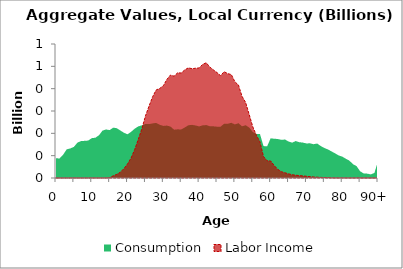
| Category | Consumption | Labor Income |
|---|---|---|
| 0 | 88.271 | 0 |
|  | 87.549 | 0 |
| 2 | 104.568 | 0 |
| 3 | 128.303 | 0 |
| 4 | 132.369 | 0 |
| 5 | 139.233 | 0 |
| 6 | 158.699 | 0 |
| 7 | 165.2 | 0 |
| 8 | 166.483 | 0 |
| 9 | 167.659 | 0 |
| 10 | 178.451 | 0 |
| 11 | 180.313 | 0 |
| 12 | 191.081 | 0 |
| 13 | 212.354 | 0 |
| 14 | 217.371 | 0 |
| 15 | 214.676 | 1.239 |
| 16 | 225.563 | 9.772 |
| 17 | 222.923 | 16.371 |
| 18 | 212.529 | 26.093 |
| 19 | 202.547 | 42.24 |
| 20 | 195.777 | 62.746 |
| 21 | 206.851 | 90.052 |
| 22 | 220.983 | 127.717 |
| 23 | 231.092 | 172.924 |
| 24 | 235.935 | 220.232 |
| 25 | 241.862 | 277.8 |
| 26 | 241.317 | 321.738 |
| 27 | 244.546 | 363.508 |
| 28 | 246.655 | 394.295 |
| 29 | 238.36 | 401.082 |
| 30 | 233.157 | 413.022 |
| 31 | 234.745 | 441.68 |
| 32 | 230.367 | 461.041 |
| 33 | 216.297 | 455.921 |
| 34 | 217.836 | 470.976 |
| 35 | 217.414 | 470.184 |
| 36 | 226.346 | 484.156 |
| 37 | 236.153 | 493.261 |
| 38 | 238.012 | 489.358 |
| 39 | 235.273 | 491.421 |
| 40 | 231.04 | 492.868 |
| 41 | 235.721 | 508.875 |
| 42 | 237.059 | 515.847 |
| 43 | 231.562 | 496.472 |
| 44 | 231.404 | 484.004 |
| 45 | 229.854 | 472.014 |
| 46 | 230.018 | 458.2 |
| 47 | 242.946 | 476.12 |
| 48 | 242.817 | 467.168 |
| 49 | 247.24 | 463.117 |
| 50 | 239.942 | 431.087 |
| 51 | 245.276 | 415.925 |
| 52 | 231.612 | 365.649 |
| 53 | 236.273 | 338.253 |
| 54 | 226.015 | 284.154 |
| 55 | 206.062 | 229.418 |
| 56 | 197.509 | 191.609 |
| 57 | 197.446 | 161.838 |
| 58 | 143.048 | 96.126 |
| 59 | 141.671 | 77.117 |
| 60 | 177.825 | 76.296 |
| 61 | 175.765 | 55.295 |
| 62 | 174.664 | 38.533 |
| 63 | 170.704 | 28.136 |
| 64 | 172.437 | 23.318 |
| 65 | 163.368 | 18.476 |
| 66 | 158.356 | 14.598 |
| 67 | 165.494 | 12.561 |
| 68 | 160.383 | 10.681 |
| 69 | 158.567 | 9.423 |
| 70 | 154.822 | 7.758 |
| 71 | 155.215 | 5.861 |
| 72 | 151.341 | 4.624 |
| 73 | 154.351 | 3.555 |
| 74 | 143.232 | 2.592 |
| 75 | 134.415 | 2.167 |
| 76 | 127.921 | 1.977 |
| 77 | 119.145 | 0.506 |
| 78 | 110.464 | 0.387 |
| 79 | 101.134 | 0.212 |
| 80 | 95.882 | 0.159 |
| 81 | 86.348 | 0.111 |
| 82 | 77.699 | 0.078 |
| 83 | 61.957 | 0.047 |
| 84 | 53.251 | 0.187 |
| 85 | 30.262 | 0.009 |
| 86 | 20.344 | 0.001 |
| 87 | 19.512 | 0 |
| 88 | 16.152 | 0 |
| 89 | 22.806 | 0 |
| 90+ | 74.911 | 0 |